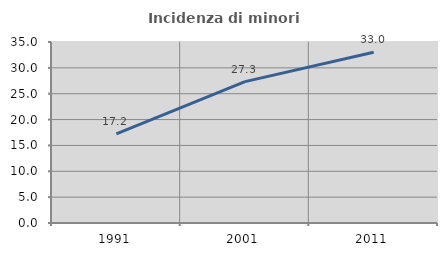
| Category | Incidenza di minori stranieri |
|---|---|
| 1991.0 | 17.241 |
| 2001.0 | 27.338 |
| 2011.0 | 33.021 |